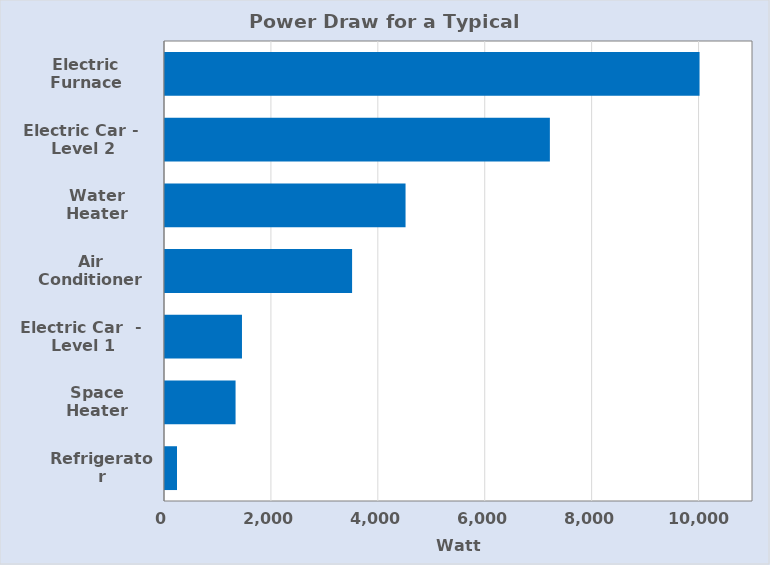
| Category | Estimated Power Draw (W) |
|---|---|
| Refrigerator | 225 |
| Space Heater | 1320 |
| Electric Car  - 
Level 1 Charging | 1440 |
| Air Conditioner | 3500 |
| Water Heater | 4500 |
| Electric Car - 
Level 2 Charging | 7200 |
| Electric Furnace | 10000 |